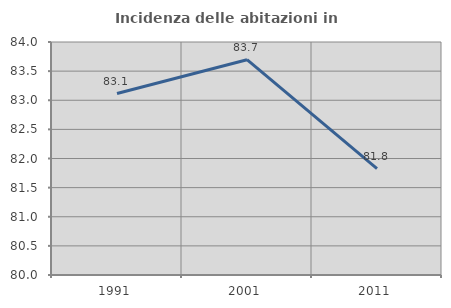
| Category | Incidenza delle abitazioni in proprietà  |
|---|---|
| 1991.0 | 83.115 |
| 2001.0 | 83.696 |
| 2011.0 | 81.826 |